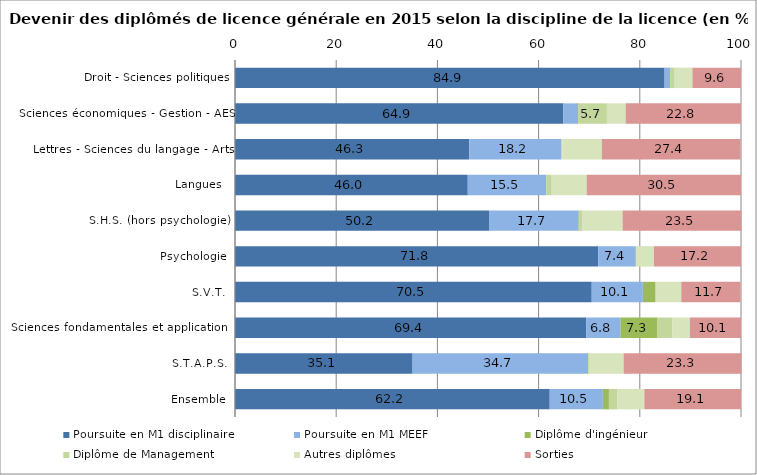
| Category | Poursuite en M1 disciplinaire | Poursuite en M1 MEEF | Diplôme d'ingénieur | Diplôme de Management | Autres diplômes | Sorties |
|---|---|---|---|---|---|---|
| Droit - Sciences politiques | 84.9 | 1.1 | 0 | 0.9 | 3.5 | 9.6 |
| Sciences économiques - Gestion - AES | 64.9 | 2.7 | 0.2 | 5.7 | 3.7 | 22.8 |
| Lettres - Sciences du langage - Arts | 46.3 | 18.2 | 0 | 0.2 | 7.8 | 27.4 |
| Langues  | 46 | 15.5 | 0 | 1.1 | 6.9 | 30.5 |
| S.H.S. (hors psychologie) | 50.2 | 17.7 | 0.1 | 0.6 | 8 | 23.5 |
| Psychologie | 71.8 | 7.4 | 0.1 | 0 | 3.5 | 17.2 |
| S.V.T. | 70.5 | 10.1 | 2.5 | 0.1 | 5 | 11.7 |
| Sciences fondamentales et applications | 69.4 | 6.8 | 7.3 | 2.9 | 3.5 | 10.1 |
| S.T.A.P.S. | 35.1 | 34.7 | 0 | 0.3 | 6.7 | 23.3 |
| Ensemble | 62.2 | 10.5 | 1.2 | 1.7 | 5.3 | 19.1 |